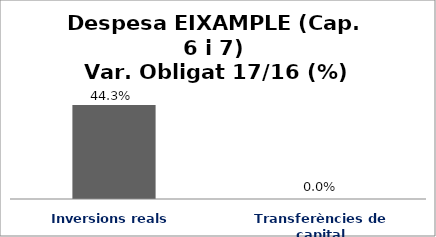
| Category | Series 0 |
|---|---|
| Inversions reals | 0.443 |
| Transferències de capital | 0 |